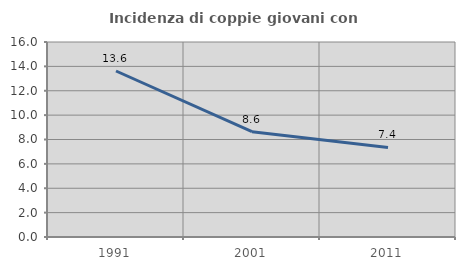
| Category | Incidenza di coppie giovani con figli |
|---|---|
| 1991.0 | 13.62 |
| 2001.0 | 8.638 |
| 2011.0 | 7.352 |